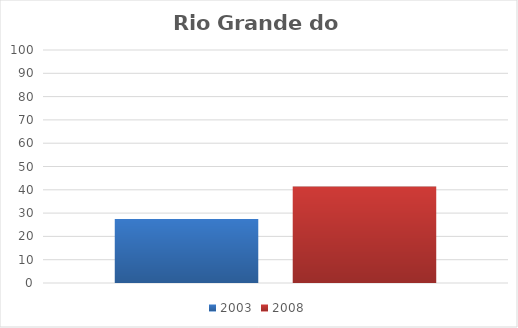
| Category | 2003 | 2008 |
|---|---|---|
| Total | 27.5 | 41.4 |